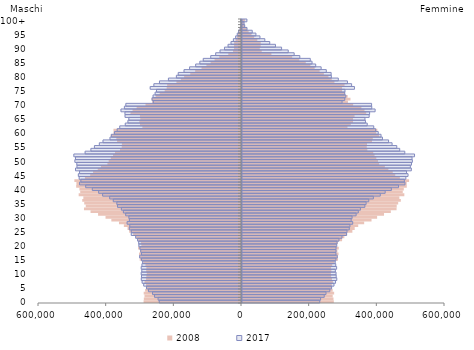
| Category | 2008 | 2017 |
|---|---|---|
| 0 | 271328 | 229715 |
| 1 | 270428 | 232341 |
| 2 | 268071 | 243051 |
| 3 | 272347 | 248317 |
| 4 | 268025 | 259588 |
| 5 | 265836 | 264936 |
| 6 | 265379 | 271907 |
| 7 | 268648 | 276469 |
| 8 | 265857 | 280176 |
| 9 | 263445 | 278386 |
| 10 | 262841 | 277946 |
| 11 | 264098 | 275869 |
| 12 | 263313 | 279700 |
| 13 | 266694 | 277050 |
| 14 | 273248 | 275425 |
| 15 | 283820 | 277590 |
| 16 | 282429 | 281617 |
| 17 | 285309 | 277574 |
| 18 | 281920 | 277761 |
| 19 | 286023 | 277955 |
| 20 | 278920 | 280050 |
| 21 | 283440 | 280881 |
| 22 | 295842 | 286685 |
| 23 | 302590 | 295505 |
| 24 | 310721 | 309085 |
| 25 | 326196 | 310363 |
| 26 | 333073 | 317031 |
| 27 | 343476 | 319062 |
| 28 | 361057 | 327215 |
| 29 | 382842 | 322689 |
| 30 | 399356 | 325389 |
| 31 | 419765 | 337338 |
| 32 | 439869 | 343695 |
| 33 | 456866 | 349933 |
| 34 | 457279 | 363105 |
| 35 | 461648 | 366854 |
| 36 | 469416 | 374681 |
| 37 | 465117 | 388300 |
| 38 | 479789 | 408750 |
| 39 | 475147 | 423150 |
| 40 | 478270 | 441547 |
| 41 | 486935 | 462597 |
| 42 | 486858 | 481644 |
| 43 | 493775 | 479807 |
| 44 | 466545 | 484359 |
| 45 | 452887 | 490771 |
| 46 | 445453 | 486315 |
| 47 | 432650 | 500510 |
| 48 | 422220 | 497551 |
| 49 | 405312 | 500963 |
| 50 | 401987 | 503528 |
| 51 | 396935 | 502585 |
| 52 | 391811 | 509981 |
| 53 | 387899 | 481147 |
| 54 | 370486 | 466134 |
| 55 | 368719 | 457465 |
| 56 | 369496 | 443616 |
| 57 | 384177 | 433237 |
| 58 | 386558 | 415215 |
| 59 | 405182 | 410961 |
| 60 | 396730 | 402645 |
| 61 | 399967 | 395024 |
| 62 | 311749 | 389415 |
| 63 | 321641 | 370081 |
| 64 | 328138 | 364913 |
| 65 | 328158 | 363379 |
| 66 | 332625 | 375874 |
| 67 | 367103 | 377207 |
| 68 | 361902 | 393456 |
| 69 | 352834 | 383588 |
| 70 | 328453 | 383055 |
| 71 | 313119 | 295796 |
| 72 | 320514 | 303675 |
| 73 | 312321 | 306808 |
| 74 | 304341 | 303664 |
| 75 | 295631 | 304337 |
| 76 | 295629 | 332405 |
| 77 | 303088 | 323969 |
| 78 | 273224 | 311651 |
| 79 | 265195 | 284665 |
| 80 | 255586 | 264101 |
| 81 | 241950 | 263468 |
| 82 | 229376 | 249119 |
| 83 | 214735 | 233954 |
| 84 | 202118 | 217872 |
| 85 | 188472 | 207078 |
| 86 | 169329 | 201779 |
| 87 | 148304 | 170905 |
| 88 | 86941 | 154162 |
| 89 | 58238 | 136622 |
| 90 | 52565 | 117023 |
| 91 | 55083 | 98951 |
| 92 | 55380 | 82010 |
| 93 | 45202 | 67448 |
| 94 | 35916 | 53068 |
| 95 | 28053 | 41112 |
| 96 | 19616 | 30226 |
| 97 | 13810 | 14762 |
| 98 | 8826 | 8012 |
| 99 | 5583 | 6105 |
| 100+ | 8565 | 14495 |